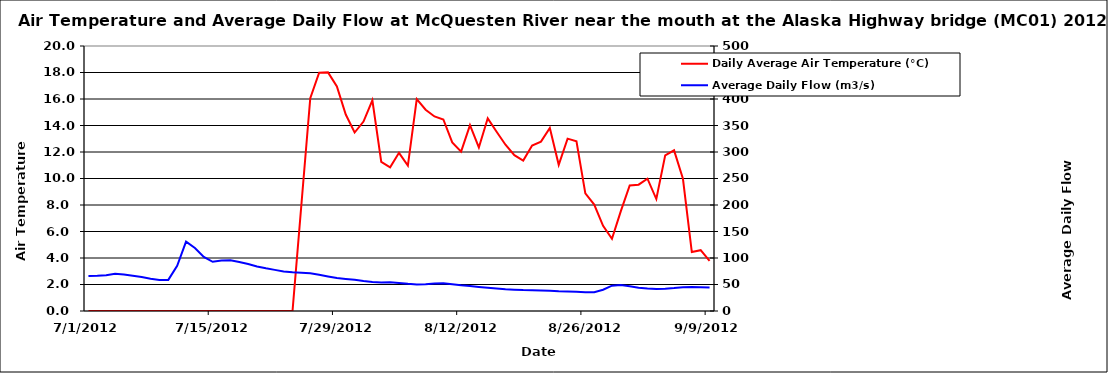
| Category | Daily Average Air Temperature (°C) |
|---|---|
| 41091.0 | 0 |
| 41092.0 | 0 |
| 41093.0 | 0 |
| 41094.0 | 0 |
| 41095.0 | 0 |
| 41096.0 | 0 |
| 41097.0 | 0 |
| 41098.0 | 0 |
| 41099.0 | 0 |
| 41100.0 | 0 |
| 41101.0 | 0 |
| 41102.0 | 0 |
| 41103.0 | 0 |
| 41104.0 | 0 |
| 41105.0 | 0 |
| 41106.0 | 0 |
| 41107.0 | 0 |
| 41108.0 | 0 |
| 41109.0 | 0 |
| 41110.0 | 0 |
| 41111.0 | 0 |
| 41112.0 | 0 |
| 41113.0 | 0 |
| 41114.0 | 0 |
| 41116.0 | 16.067 |
| 41117.0 | 17.979 |
| 41118.0 | 18.008 |
| 41119.0 | 16.942 |
| 41120.0 | 14.829 |
| 41121.0 | 13.471 |
| 41122.0 | 14.3 |
| 41123.0 | 15.904 |
| 41124.0 | 11.25 |
| 41125.0 | 10.842 |
| 41126.0 | 11.938 |
| 41127.0 | 10.979 |
| 41128.0 | 15.983 |
| 41129.0 | 15.192 |
| 41130.0 | 14.683 |
| 41131.0 | 14.454 |
| 41132.0 | 12.725 |
| 41133.0 | 12.025 |
| 41134.0 | 14.025 |
| 41135.0 | 12.342 |
| 41136.0 | 14.542 |
| 41137.0 | 13.533 |
| 41138.0 | 12.55 |
| 41138.0 | 12.55 |
| 41139.0 | 11.758 |
| 41139.0 | 11.758 |
| 41140.0 | 11.354 |
| 41141.0 | 12.492 |
| 41142.0 | 12.783 |
| 41143.0 | 13.817 |
| 41144.0 | 11.033 |
| 41145.0 | 13.008 |
| 41146.0 | 12.808 |
| 41147.0 | 8.875 |
| 41148.0 | 8.033 |
| 41149.0 | 6.425 |
| 41150.0 | 5.45 |
| 41151.0 | 7.542 |
| 41152.0 | 9.479 |
| 41153.0 | 9.533 |
| 41154.0 | 9.987 |
| 41155.0 | 8.45 |
| 41156.0 | 11.746 |
| 41157.0 | 12.125 |
| 41158.0 | 9.979 |
| 41159.0 | 4.45 |
| 41160.0 | 4.592 |
| 41161.0 | 3.779 |